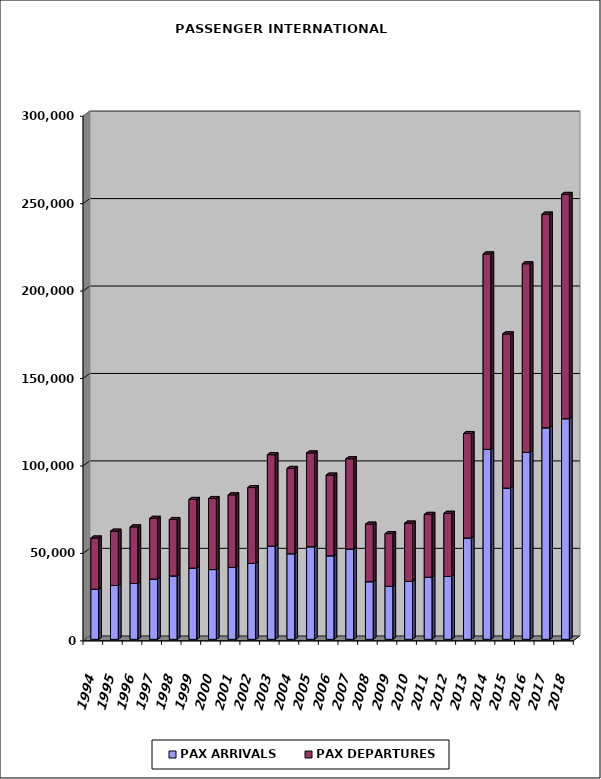
| Category | PAX ARRIVALS | PAX DEPARTURES |
|---|---|---|
| 1994.0 | 28654 | 29285 |
| 1995.0 | 30793 | 31053 |
| 1996.0 | 31936 | 32367 |
| 1997.0 | 34454 | 34737 |
| 1998.0 | 36249 | 32286 |
| 1999.0 | 40723 | 39279 |
| 2000.0 | 39900 | 40633 |
| 2001.0 | 41119 | 41505 |
| 2002.0 | 43383 | 43398 |
| 2003.0 | 53280 | 52279 |
| 2004.0 | 48949 | 48774 |
| 2005.0 | 52931 | 53644 |
| 2006.0 | 47767 | 46141 |
| 2007.0 | 51641 | 51616 |
| 2008.0 | 32950 | 32910 |
| 2009.0 | 30272 | 30187 |
| 2010.0 | 33144 | 33338 |
| 2011.0 | 35502 | 35950 |
| 2012.0 | 35948 | 36114 |
| 2013.0 | 57947 | 59736 |
| 2014.0 | 108623 | 111751 |
| 2015.0 | 86508 | 88159 |
| 2016.0 | 106921 | 107827 |
| 2017.0 | 120968 | 122192 |
| 2018.0 | 126162 | 128256 |